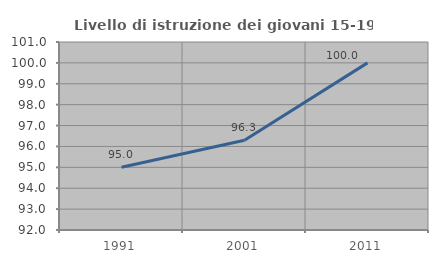
| Category | Livello di istruzione dei giovani 15-19 anni |
|---|---|
| 1991.0 | 95 |
| 2001.0 | 96.296 |
| 2011.0 | 100 |